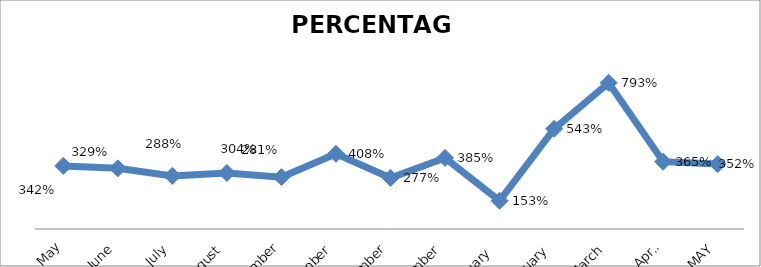
| Category | PERCENTAGE |
|---|---|
| May | 3.42 |
| June | 3.289 |
| July | 2.88 |
| August | 3.039 |
| September | 2.811 |
| October | 4.077 |
| November | 2.769 |
| December | 3.853 |
| January  | 1.529 |
| February | 5.432 |
| March | 7.927 |
| April | 3.649 |
| MAY | 3.52 |